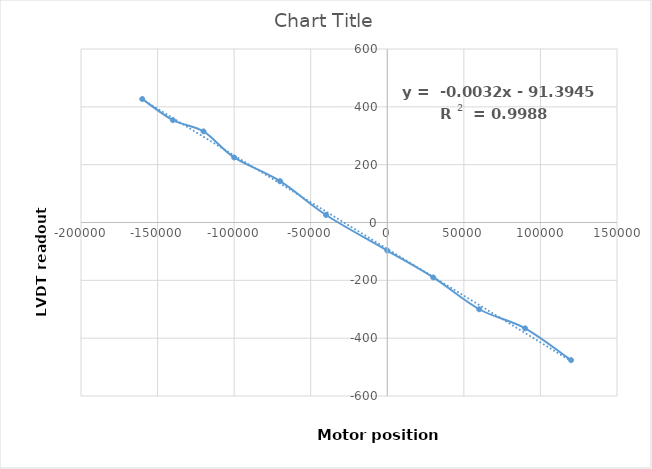
| Category | Series 0 |
|---|---|
| -160000.0 | 427 |
| -140000.0 | 354 |
| -120000.0 | 315 |
| -100000.0 | 225 |
| -70000.0 | 143 |
| -40000.0 | 26 |
| 0.0 | -97 |
| 30000.0 | -190 |
| 60000.0 | -300 |
| 90000.0 | -366 |
| 120000.0 | -476 |